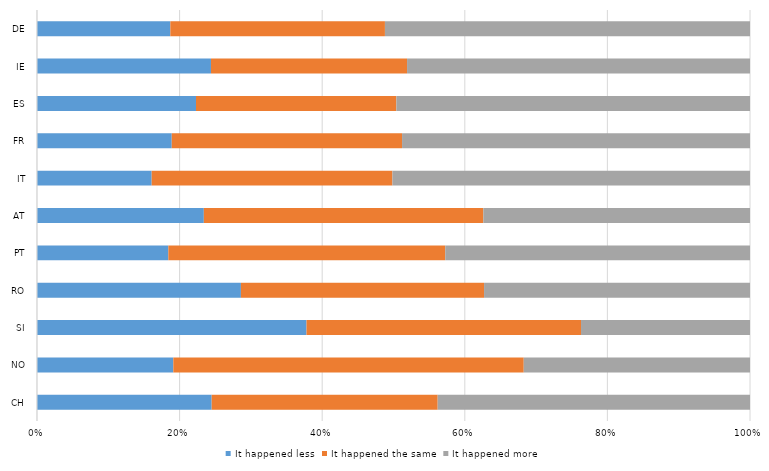
| Category | It happened less | It happened the same | It happened more |
|---|---|---|---|
| DE | 0.187 | 0.301 | 0.512 |
| IE | 0.244 | 0.275 | 0.481 |
| ES | 0.223 | 0.281 | 0.496 |
| FR | 0.189 | 0.323 | 0.488 |
| IT | 0.161 | 0.338 | 0.502 |
| AT | 0.234 | 0.392 | 0.374 |
| PT | 0.184 | 0.388 | 0.427 |
| RO | 0.286 | 0.341 | 0.373 |
| SI | 0.378 | 0.385 | 0.237 |
| NO | 0.191 | 0.491 | 0.317 |
| CH | 0.245 | 0.317 | 0.438 |